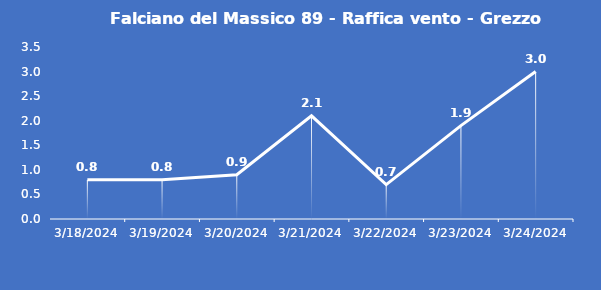
| Category | Falciano del Massico 89 - Raffica vento - Grezzo (m/s) |
|---|---|
| 3/18/24 | 0.8 |
| 3/19/24 | 0.8 |
| 3/20/24 | 0.9 |
| 3/21/24 | 2.1 |
| 3/22/24 | 0.7 |
| 3/23/24 | 1.9 |
| 3/24/24 | 3 |